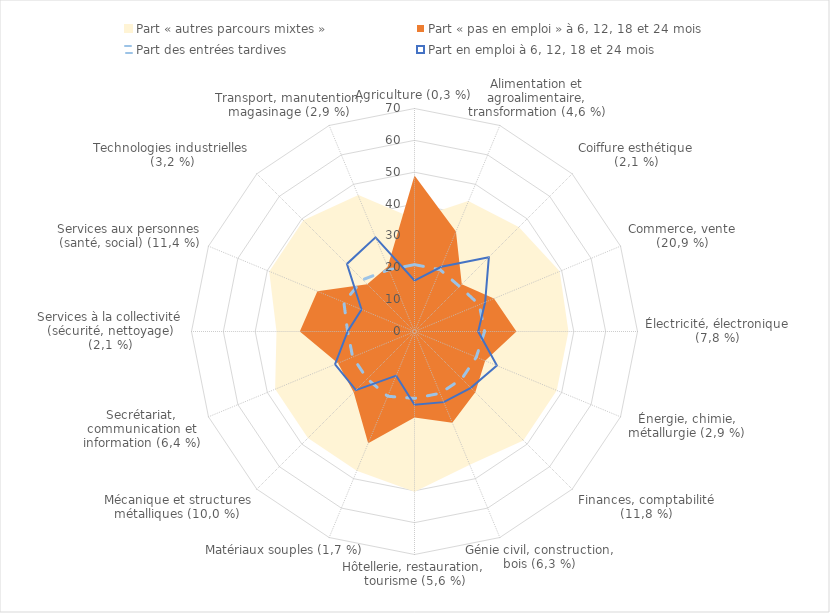
| Category | Part « autres parcours mixtes » | Part « pas en emploi » à 6, 12, 18 et 24 mois | Part des entrées tardives | Part en emploi à 6, 12, 18 et 24 mois |
|---|---|---|---|---|
| Agriculture (0,3 %) | 35 | 49 | 21 | 16 |
| Alimentation et agroalimentaire, transformation (4,6 %) | 44 | 34 | 21 | 22 |
| Coiffure esthétique (2,1 %) | 46 | 21 | 20 | 33 |
| Commerce, vente (20,9 %) | 49 | 27 | 22 | 24 |
| Électricité, électronique (7,8 %) | 48 | 32 | 22 | 20 |
| Énergie, chimie, métallurgie (2,9 %) | 48 | 24 | 21 | 28 |
| Finances, comptabilité (11,8 %) | 48 | 27 | 21 | 25 |
| Génie civil, construction, bois (6,3 %) | 45 | 31 | 21 | 24 |
| Hôtellerie, restauration, tourisme (5,6 %) | 50 | 27 | 21 | 23 |
| Matériaux souples (1,7 %) | 47 | 38 | 22 | 15 |
| Mécanique et structures métalliques (10,0 %) | 47 | 27 | 21 | 26 |
| Secrétariat, communication et information (6,4 %) | 47 | 26 | 21 | 27 |
| Services à la collectivité (sécurité, nettoyage) (2,1 %) | 43 | 36 | 21 | 21 |
| Services aux personnes (santé, social) (11,4 %) | 49 | 33 | 24 | 18 |
| Technologies industrielles (3,2 %) | 49 | 21 | 23 | 30 |
| Transport, manutention, magasinage (2,9 %) | 46 | 22 | 21 | 32 |